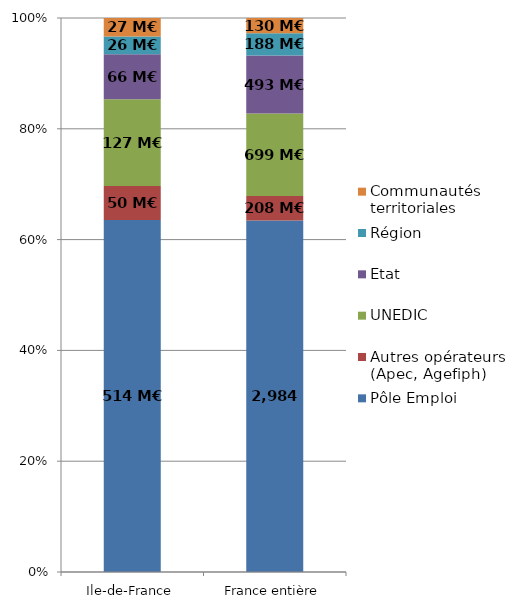
| Category | Pôle Emploi | Autres opérateurs (Apec, Agefiph) | UNEDIC | Etat | Région | Communautés territoriales |
|---|---|---|---|---|---|---|
| Ile-de-France | 514.085 | 49.798 | 126.593 | 65.501 | 25.963 | 27.16 |
| France entière | 2983.694 | 207.577 | 699.479 | 493.308 | 188.079 | 129.71 |